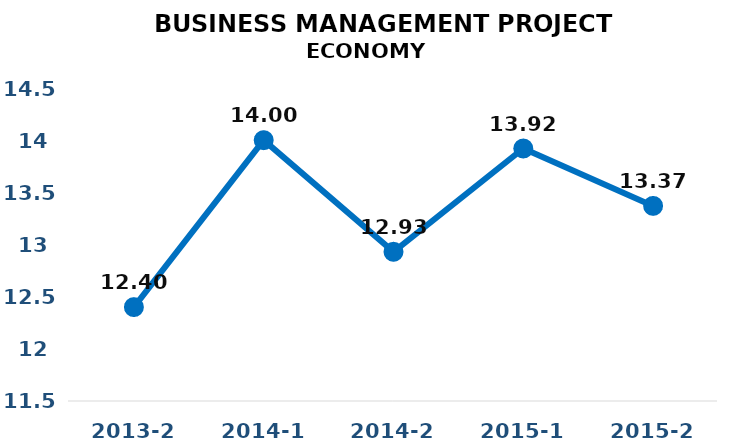
| Category | Series 0 |
|---|---|
| 2013-2 | 12.4 |
| 2014-1 | 14 |
| 2014-2 | 12.93 |
| 2015-1 | 13.92 |
| 2015-2 | 13.37 |